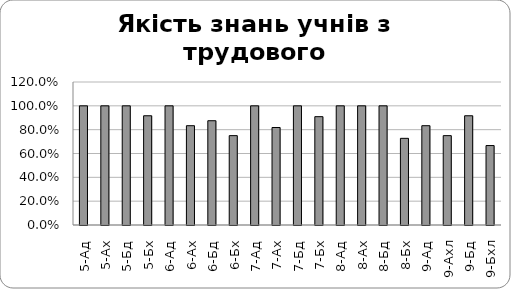
| Category | Series 0 |
|---|---|
| 5-Ад | 1 |
| 5-Ах | 1 |
| 5-Бд | 1 |
| 5-Бх | 0.917 |
| 6-Ад | 1 |
| 6-Ах | 0.833 |
| 6-Бд | 0.875 |
| 6-Бх | 0.75 |
| 7-Ад | 1 |
| 7-Ах | 0.818 |
| 7-Бд | 1 |
| 7-Бх | 0.909 |
| 8-Ад | 1 |
| 8-Ах | 1 |
| 8-Бд | 1 |
| 8-Бх | 0.727 |
| 9-Ад | 0.833 |
| 9-Ахл | 0.75 |
| 9-Бд | 0.917 |
| 9-Бхл | 0.667 |